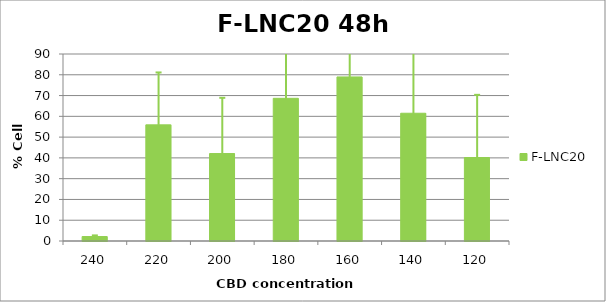
| Category | F-LNC20 |
|---|---|
| 240.0 | 2.144 |
| 220.0 | 55.894 |
| 200.0 | 42.094 |
| 180.0 | 68.672 |
| 160.0 | 78.962 |
| 140.0 | 61.49 |
| 120.0 | 40.178 |